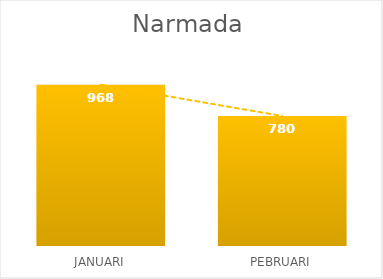
| Category | Series 0 |
|---|---|
| JANUARI | 968 |
| PEBRUARI | 780 |